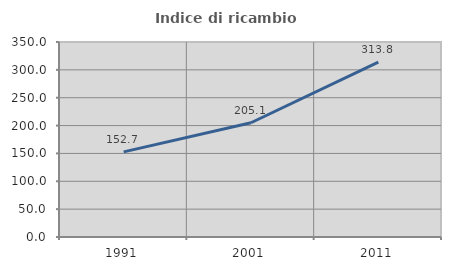
| Category | Indice di ricambio occupazionale  |
|---|---|
| 1991.0 | 152.736 |
| 2001.0 | 205.09 |
| 2011.0 | 313.768 |